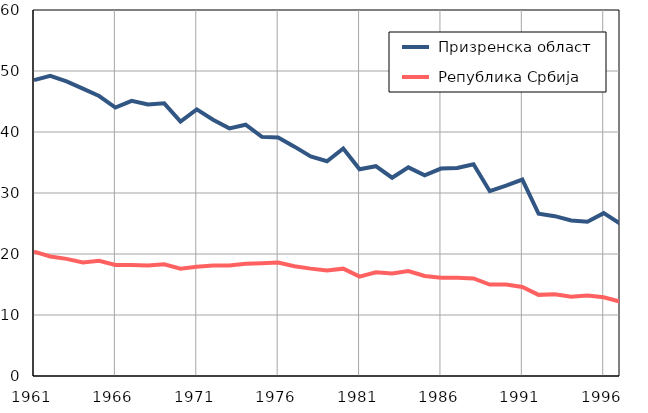
| Category |  Призренска област |  Република Србија |
|---|---|---|
| 1961.0 | 48.5 | 20.4 |
| 1962.0 | 49.2 | 19.6 |
| 1963.0 | 48.3 | 19.2 |
| 1964.0 | 47.1 | 18.6 |
| 1965.0 | 45.9 | 18.9 |
| 1966.0 | 44 | 18.2 |
| 1967.0 | 45.1 | 18.2 |
| 1968.0 | 44.5 | 18.1 |
| 1969.0 | 44.7 | 18.3 |
| 1970.0 | 41.7 | 17.6 |
| 1971.0 | 43.7 | 17.9 |
| 1972.0 | 42 | 18.1 |
| 1973.0 | 40.6 | 18.1 |
| 1974.0 | 41.2 | 18.4 |
| 1975.0 | 39.2 | 18.5 |
| 1976.0 | 39.1 | 18.6 |
| 1977.0 | 37.6 | 18 |
| 1978.0 | 36 | 17.6 |
| 1979.0 | 35.2 | 17.3 |
| 1980.0 | 37.3 | 17.6 |
| 1981.0 | 33.9 | 16.3 |
| 1982.0 | 34.4 | 17 |
| 1983.0 | 32.5 | 16.8 |
| 1984.0 | 34.2 | 17.2 |
| 1985.0 | 32.9 | 16.4 |
| 1986.0 | 34 | 16.1 |
| 1987.0 | 34.1 | 16.1 |
| 1988.0 | 34.7 | 16 |
| 1989.0 | 30.3 | 15 |
| 1990.0 | 31.2 | 15 |
| 1991.0 | 32.2 | 14.6 |
| 1992.0 | 26.6 | 13.3 |
| 1993.0 | 26.2 | 13.4 |
| 1994.0 | 25.5 | 13 |
| 1995.0 | 25.3 | 13.2 |
| 1996.0 | 26.7 | 12.9 |
| 1997.0 | 25 | 12.2 |